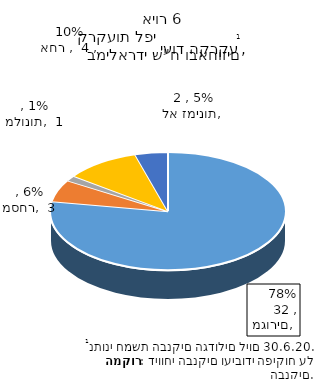
| Category | Series 0 |
|---|---|
| מגורים | 32.4 |
| מסחר | 2.519 |
| מלונות | 0.614 |
| אחר  | 4.3 |
| לא זמינות | 1.881 |